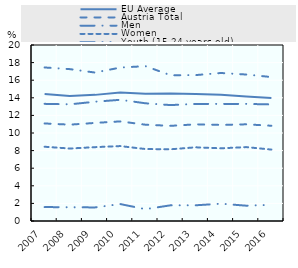
| Category | EU Average | Austria Total | Men | Women | Youth (15-24 years old) | Seniors (50-64 years old) |
|---|---|---|---|---|---|---|
| 2007.0 | 14.419 | 11.086 | 13.312 | 8.439 | 1.585 | 17.447 |
| 2008.0 | 14.216 | 10.948 | 13.257 | 8.236 | 1.56 | 17.257 |
| 2009.0 | 14.333 | 11.145 | 13.554 | 8.391 | 1.544 | 16.87 |
| 2010.0 | 14.595 | 11.319 | 13.772 | 8.514 | 1.926 | 17.436 |
| 2011.0 | 14.446 | 10.943 | 13.377 | 8.178 | 1.345 | 17.597 |
| 2012.0 | 14.502 | 10.814 | 13.172 | 8.15 | 1.784 | 16.561 |
| 2013.0 | 14.418 | 10.985 | 13.307 | 8.373 | 1.785 | 16.582 |
| 2014.0 | 14.354 | 10.919 | 13.305 | 8.26 | 1.968 | 16.82 |
| 2015.0 | 14.148 | 10.987 | 13.308 | 8.398 | 1.74 | 16.645 |
| 2016.0 | 13.986 | 10.824 | 13.246 | 8.115 | 1.836 | 16.36 |